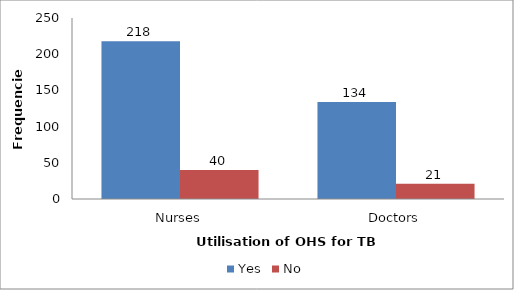
| Category | Yes | No  |
|---|---|---|
| Nurses | 218 | 40 |
| Doctors | 134 | 21 |